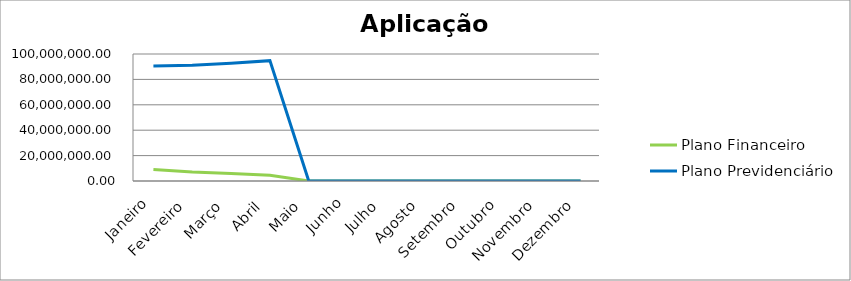
| Category | Plano Financeiro | Plano Previdenciário |
|---|---|---|
| Janeiro | 9042848.22 | 90584842.25 |
| Fevereiro | 7009964.55 | 91082321.75 |
| Março | 5999673.19 | 92778765.64 |
| Abril | 4514684.49 | 94757392.64 |
| Maio | 0 | 0 |
| Junho | 0 | 0 |
| Julho | 0 | 0 |
| Agosto | 0 | 0 |
| Setembro | 0 | 0 |
| Outubro | 0 | 0 |
| Novembro | 0 | 0 |
| Dezembro | 0 | 0 |